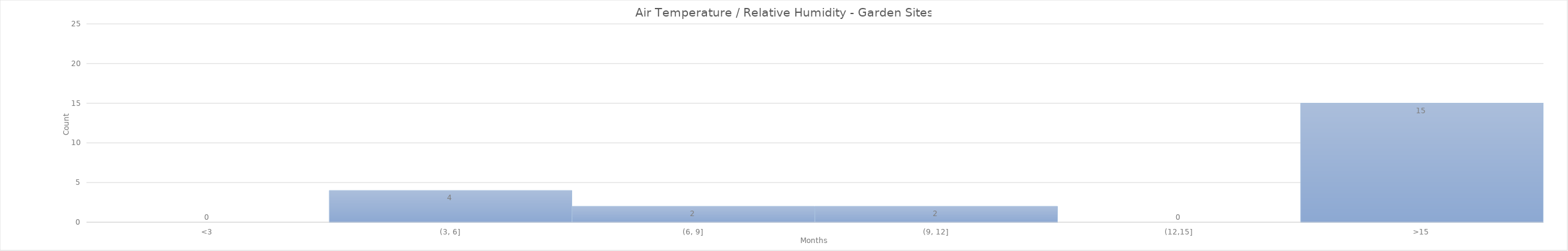
| Category | Series 0 |
|---|---|
| <3 | 0 |
| (3, 6] | 4 |
| (6, 9] | 2 |
| (9, 12] | 2 |
| (12,15] | 0 |
| >15 | 15 |